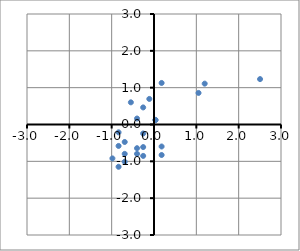
| Category | Series 0 |
|---|---|
| -0.2557538057398536 | 0.463 |
| -0.837012455148612 | -0.582 |
| -0.837012455148612 | -0.213 |
| -0.6916977927964224 | -1.013 |
| -0.4010684680920432 | -0.797 |
| -0.2557538057398536 | -0.244 |
| -0.9823271175008016 | -0.92 |
| -0.2557538057398536 | -0.613 |
| 3.086483428360507 | 3.231 |
| -0.5463831304442328 | 0.602 |
| 1.0520781554298526 | 0.857 |
| 0.1801901813167151 | -0.597 |
| -0.6916977927964224 | -0.474 |
| -0.4010684680920432 | 0.162 |
| 0.03487551896452553 | 0.119 |
| 0.1801901813167151 | 1.128 |
| -0.4010684680920432 | -0.644 |
| -0.2557538057398536 | -0.853 |
| -0.837012455148612 | -1.148 |
| 1.1973928177820423 | 1.109 |
| 0.1801901813167151 | -0.828 |
| 2.5052247789517486 | 1.232 |
| 0.03487551896452553 | 0.125 |
| -0.11043914338766406 | 0.694 |
| -0.6916977927964224 | -0.797 |